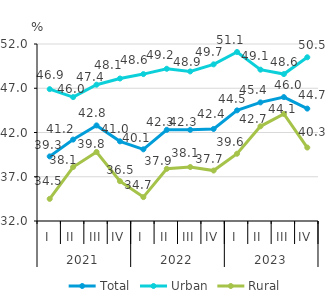
| Category | Total | Urban | Rural |
|---|---|---|---|
| 0 | 39.3 | 46.9 | 34.5 |
| 1 | 41.2 | 46 | 38.1 |
| 2 | 42.8 | 47.4 | 39.8 |
| 3 | 41 | 48.1 | 36.5 |
| 4 | 40.1 | 48.6 | 34.7 |
| 5 | 42.3 | 49.2 | 37.9 |
| 6 | 42.3 | 48.9 | 38.1 |
| 7 | 42.4 | 49.7 | 37.7 |
| 8 | 44.5 | 51.1 | 39.6 |
| 9 | 45.4 | 49.1 | 42.7 |
| 10 | 46 | 48.6 | 44.1 |
| 11 | 44.7 | 50.5 | 40.3 |